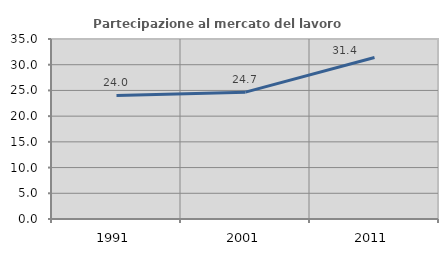
| Category | Partecipazione al mercato del lavoro  femminile |
|---|---|
| 1991.0 | 24.033 |
| 2001.0 | 24.662 |
| 2011.0 | 31.395 |